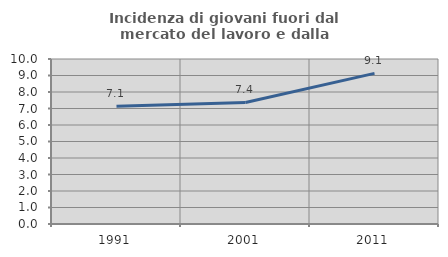
| Category | Incidenza di giovani fuori dal mercato del lavoro e dalla formazione  |
|---|---|
| 1991.0 | 7.14 |
| 2001.0 | 7.364 |
| 2011.0 | 9.131 |